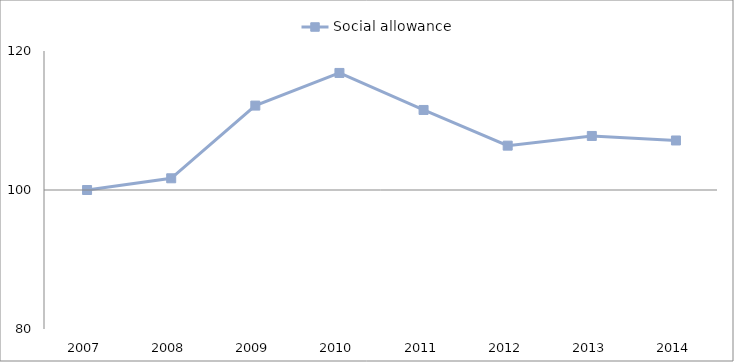
| Category | Social allowance | 0 |
|---|---|---|
| 2007.0 | 100 |  |
| 2008.0 | 101.686 |  |
| 2009.0 | 112.145 |  |
| 2010.0 | 116.843 |  |
| 2011.0 | 111.517 |  |
| 2012.0 | 106.382 |  |
| 2013.0 | 107.774 |  |
| 2014.0 | 107.126 |  |